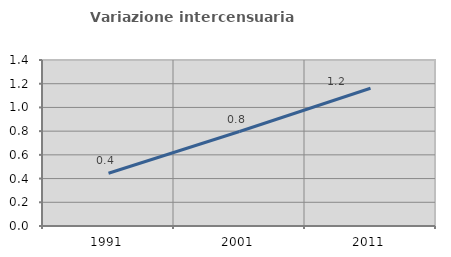
| Category | Variazione intercensuaria annua |
|---|---|
| 1991.0 | 0.445 |
| 2001.0 | 0.797 |
| 2011.0 | 1.162 |